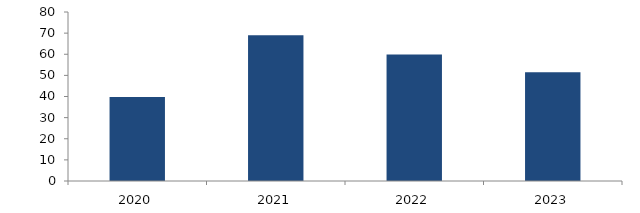
| Category | Bogotá |
|---|---|
| 2020.0 | 39.759 |
| 2021.0 | 69.019 |
| 2022.0 | 59.854 |
| 2023.0 | 51.438 |